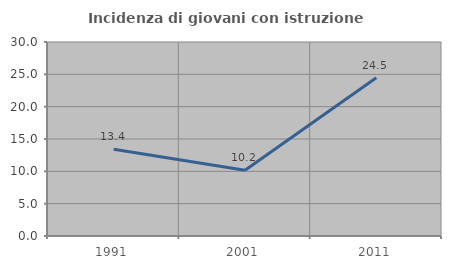
| Category | Incidenza di giovani con istruzione universitaria |
|---|---|
| 1991.0 | 13.42 |
| 2001.0 | 10.169 |
| 2011.0 | 24.476 |